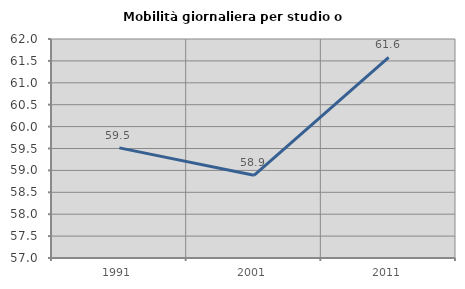
| Category | Mobilità giornaliera per studio o lavoro |
|---|---|
| 1991.0 | 59.514 |
| 2001.0 | 58.888 |
| 2011.0 | 61.581 |